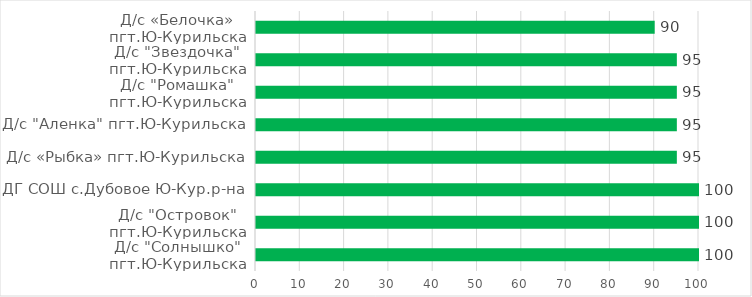
| Category | Series 0 |
|---|---|
| Д/с "Солнышко" пгт.Ю-Курильска | 100 |
| Д/с "Островок" пгт.Ю-Курильска | 100 |
| ДГ СОШ с.Дубовое Ю-Кур.р-на | 100 |
| Д/с «Рыбка» пгт.Ю-Курильска | 95 |
| Д/с "Аленка" пгт.Ю-Курильска | 95 |
| Д/с "Ромашка" пгт.Ю-Курильска | 95 |
| Д/с "Звездочка" пгт.Ю-Курильска | 95 |
| Д/с «Белочка» пгт.Ю-Курильска | 90 |